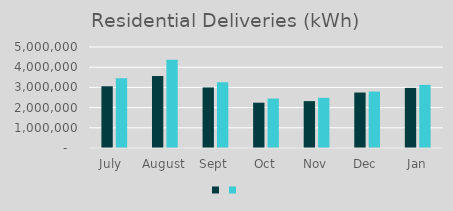
| Category | Series 1 | Series 0 |
|---|---|---|
| July  | 3056084 | 3456641 |
| August | 3564883 | 4364840 |
| Sept | 2997393 | 3255766 |
| Oct | 2243531 | 2448610 |
| Nov | 2320465 | 2484917 |
| Dec | 2746090 | 2793607 |
| Jan | 2975165 | 3124442 |